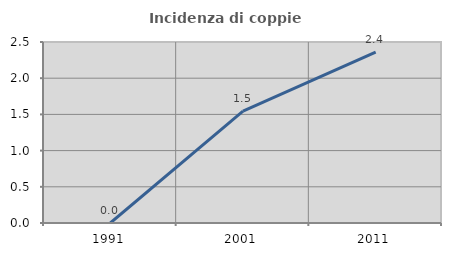
| Category | Incidenza di coppie miste |
|---|---|
| 1991.0 | 0 |
| 2001.0 | 1.544 |
| 2011.0 | 2.361 |